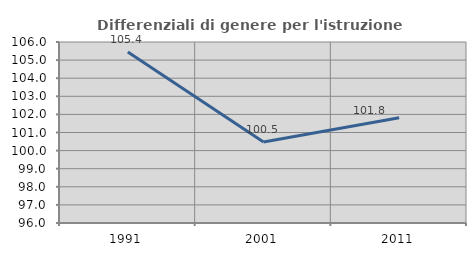
| Category | Differenziali di genere per l'istruzione superiore |
|---|---|
| 1991.0 | 105.444 |
| 2001.0 | 100.479 |
| 2011.0 | 101.811 |